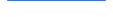
| Category | Series 0 |
|---|---|
| 0 | 1 |
| 1 | 2 |
| 2 | 1 |
| 3 | 1 |
| 4 | 4 |
| 5 | 2 |
| 6 | 2 |
| 7 | 2 |
| 8 | 3 |